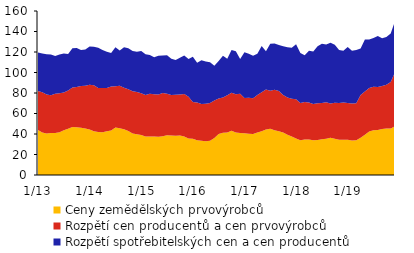
| Category | Ceny zemědělských prvovýrobců  | Rozpětí cen producentů a cen prvovýrobců  | Rozpětí spotřebitelských cen a cen producentů |
|---|---|---|---|
|  1/13 | 43.793 | 38.137 | 37.57 |
| 2 | 41.534 | 39.286 | 37.73 |
| 3 | 40.453 | 38.067 | 39.37 |
| 4 | 40.883 | 36.947 | 39.84 |
| 5 | 41.025 | 38.195 | 36.87 |
| 6 | 41.806 | 37.944 | 37.69 |
| 7 | 43.636 | 36.774 | 38.09 |
| 8 | 45.072 | 37.338 | 35.59 |
| 9 | 46.806 | 38.464 | 38.34 |
| 10 | 46.538 | 39.202 | 38.24 |
| 11 | 46.062 | 40.798 | 35.17 |
| 12 | 45.487 | 41.683 | 35.36 |
|  1/14 | 44.429 | 43.631 | 37.35 |
| 2 | 42.76 | 44.75 | 37.58 |
| 3 | 41.867 | 43.133 | 39.22 |
| 4 | 41.808 | 43.182 | 36.91 |
| 5 | 42.567 | 42.293 | 35.46 |
| 6 | 43.501 | 42.819 | 32.8 |
| 7 | 46.223 | 40.247 | 38.16 |
| 8 | 45.731 | 41.439 | 34.3 |
| 9 | 44.533 | 40.627 | 39.42 |
| 10 | 42.99 | 40.58 | 40 |
| 11 | 40.441 | 41.359 | 39.22 |
| 12 | 39.765 | 41.315 | 39.2 |
|  1/15 | 39.048 | 40.622 | 41.39 |
| 2 | 37.603 | 40.557 | 39.7 |
| 3 | 37.596 | 41.744 | 37.66 |
| 4 | 37.643 | 41.147 | 36.05 |
| 5 | 37.239 | 41.341 | 37.66 |
| 6 | 37.833 | 42.137 | 36.69 |
| 7 | 38.689 | 40.511 | 37.61 |
| 8 | 38.578 | 39.462 | 35.49 |
| 9 | 38.339 | 39.901 | 34.03 |
| 10 | 38.555 | 40.045 | 35.86 |
| 11 | 37.56 | 41.56 | 37.44 |
| 12 | 35.656 | 40.664 | 36.88 |
|  1/16 | 35.456 | 35.834 | 44.19 |
| 2 | 33.862 | 36.978 | 38.73 |
| 3 | 33.483 | 35.717 | 42.7 |
| 4 | 32.939 | 36.461 | 41.44 |
| 5 | 33.417 | 36.733 | 39.95 |
| 6 | 36 | 36.65 | 33.85 |
| 7 | 39.969 | 34.711 | 36.54 |
| 8 | 41.163 | 34.397 | 40.82 |
| 9 | 41.522 | 36.198 | 35.62 |
| 10 | 43.265 | 36.895 | 41.71 |
| 11 | 41.523 | 37.357 | 41.83 |
| 12 | 40.94 | 38.4 | 33.8 |
|  1/17 | 40.757 | 34.343 | 44.72 |
| 2 | 40.255 | 35.035 | 42.89 |
| 3 | 39.978 | 34.792 | 41.69 |
| 4 | 41.355 | 36.625 | 40.27 |
| 5 | 42.661 | 38.039 | 45.05 |
| 6 | 44.333 | 39.007 | 37.5 |
| 7 | 45.09 | 37.18 | 45.75 |
| 8 | 43.778 | 39.382 | 45.12 |
| 9 | 42.682 | 39.308 | 44.88 |
| 10 | 41.363 | 36.737 | 47.58 |
| 11 | 39.319 | 36.371 | 49.05 |
| 12 | 37.448 | 36.882 | 49.8 |
|  1/18 | 35.573 | 38.287 | 53.81 |
| 2 | 33.988 | 36.272 | 48.74 |
| 3 | 34.615 | 36.575 | 45.66 |
| 4 | 34.72 | 35.97 | 50.46 |
| 5 | 33.861 | 35.299 | 51.38 |
| 6 | 34.118 | 35.802 | 55.66 |
| 7 | 34.957 | 35.293 | 57.71 |
| 8 | 35.353 | 35.607 | 56.45 |
| 9 | 36.454 | 33.186 | 59.35 |
| 10 | 35.38 | 35.02 | 56.69 |
| 11 | 34.453 | 35.727 | 51.72 |
| 12 | 34.293 | 36.517 | 50.29 |
|  1/19 | 34.342 | 35.808 | 54.7 |
| 2 | 33.769 | 36.071 | 51.44 |
| 3 | 33.864 | 36.256 | 51.94 |
| 4 | 36.443 | 41.527 | 45.54 |
| 5 | 39.358 | 42.182 | 50.54 |
| 6 | 42.404 | 42.366 | 47.53 |
| 7 | 43.732 | 42.308 | 47.7 |
| 8 | 43.84 | 42.02 | 49.77 |
| 9 | 44.905 | 41.995 | 46.56 |
| 10 | 45.342 | 42.658 | 46.66 |
| 11 | 45.323 | 45.297 | 47.36 |
| 12 | 47.481 | 52.839 | 49.68 |